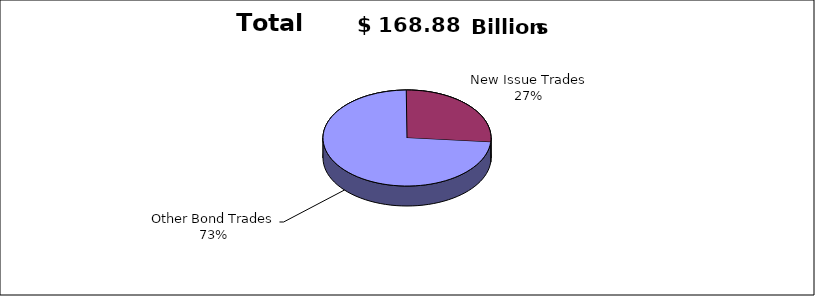
| Category | Series 0 |
|---|---|
| Other Bond Trades | 124077984690 |
| New Issue Trades | 44803052000 |